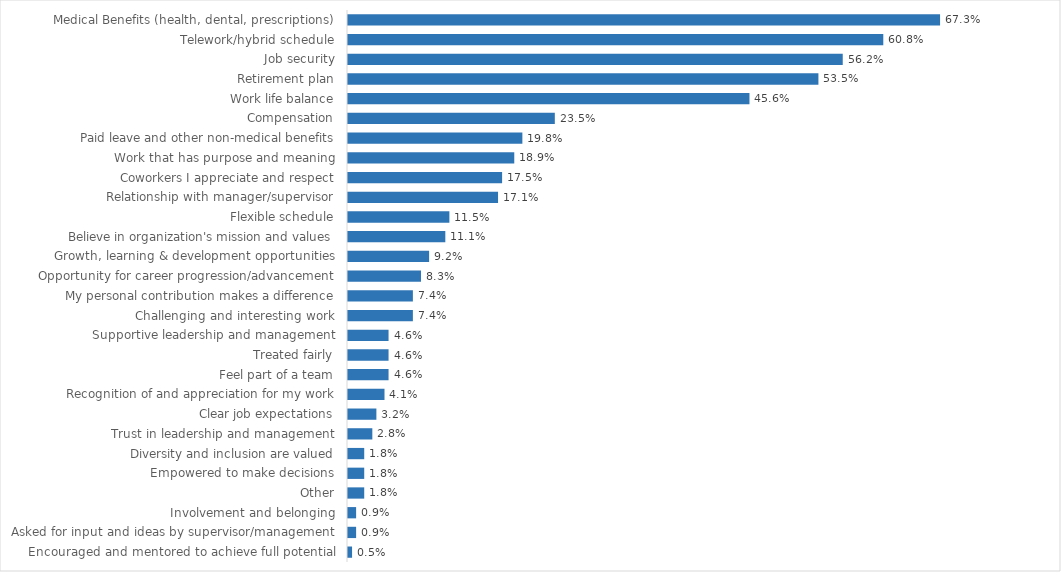
| Category | Digital Services |
|---|---|
| Medical Benefits (health, dental, prescriptions) | 0.673 |
| Telework/hybrid schedule | 0.608 |
| Job security | 0.562 |
| Retirement plan | 0.535 |
| Work life balance | 0.456 |
| Compensation | 0.235 |
| Paid leave and other non-medical benefits | 0.198 |
| Work that has purpose and meaning | 0.189 |
| Coworkers I appreciate and respect | 0.175 |
| Relationship with manager/supervisor | 0.171 |
| Flexible schedule | 0.115 |
| Believe in organization's mission and values | 0.111 |
| Growth, learning & development opportunities | 0.092 |
| Opportunity for career progression/advancement | 0.083 |
| My personal contribution makes a difference | 0.074 |
| Challenging and interesting work | 0.074 |
| Supportive leadership and management | 0.046 |
| Treated fairly | 0.046 |
| Feel part of a team | 0.046 |
| Recognition of and appreciation for my work | 0.041 |
| Clear job expectations | 0.032 |
| Trust in leadership and management | 0.028 |
| Diversity and inclusion are valued | 0.018 |
| Empowered to make decisions | 0.018 |
| Other | 0.018 |
| Involvement and belonging | 0.009 |
| Asked for input and ideas by supervisor/management | 0.009 |
| Encouraged and mentored to achieve full potential | 0.005 |